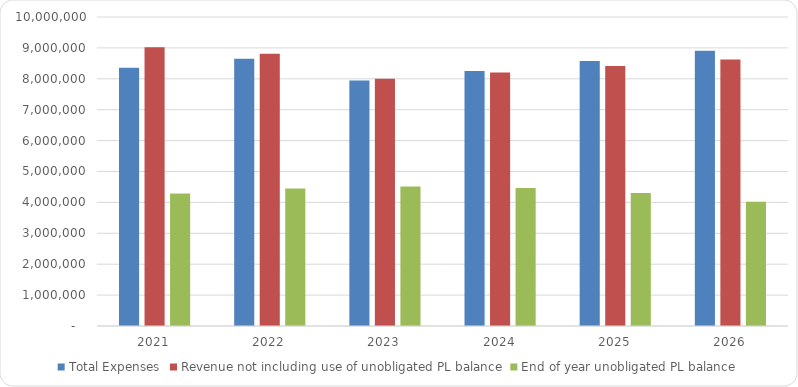
| Category | Total Expenses | Revenue not including use of unobligated PL balance | End of year unobligated PL balance |
|---|---|---|---|
| 2021.0 | 8361215.52 | 9021277.11 | 4289261.65 |
| 2022.0 | 8647118.077 | 8809863.913 | 4452007.486 |
| 2023.0 | 7944525.686 | 8005300.282 | 4512782.083 |
| 2024.0 | 8253915.255 | 8206351.751 | 4465218.579 |
| 2025.0 | 8575783.932 | 8413181.814 | 4302616.461 |
| 2026.0 | 8910649.975 | 8625958.768 | 4017925.254 |